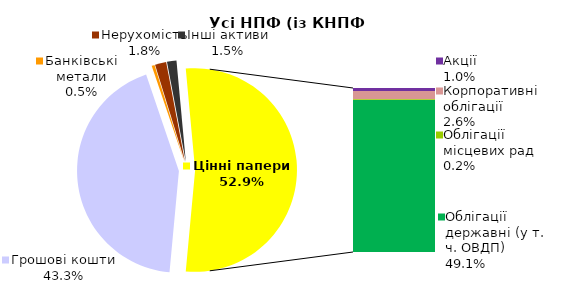
| Category | Усі НПФ (із КНПФ НБУ)* |
|---|---|
| Грошові кошти | 1940.881 |
| Банківські метали | 20.695 |
| Нерухомість | 80.119 |
| Інші активи | 67.181 |
| Акції | 45.079 |
| Корпоративні облігації | 117.838 |
| Облігації місцевих рад | 11.149 |
| Облігації державні (у т. ч. ОВДП) | 2198.554 |